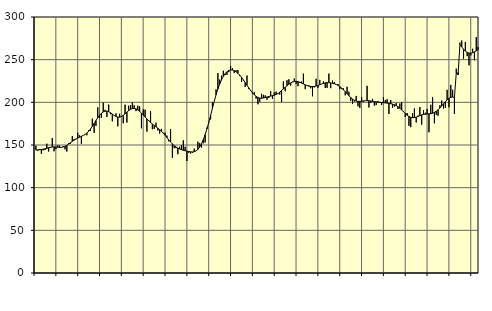
| Category | Piggar | Series 1 |
|---|---|---|
| nan | 149.1 | 144.2 |
| 1.0 | 143.1 | 144.2 |
| 1.0 | 145.3 | 144.4 |
| 1.0 | 139.7 | 144.72 |
| 1.0 | 143.7 | 145.1 |
| 1.0 | 144.1 | 145.56 |
| 1.0 | 151.5 | 146.1 |
| 1.0 | 142.4 | 146.74 |
| 1.0 | 147 | 147.3 |
| 1.0 | 158.2 | 147.66 |
| 1.0 | 142.6 | 147.77 |
| 1.0 | 145.2 | 147.68 |
| nan | 149.8 | 147.46 |
| 2.0 | 149.3 | 147.24 |
| 2.0 | 147 | 147.25 |
| 2.0 | 148.5 | 147.62 |
| 2.0 | 144.9 | 148.42 |
| 2.0 | 142.3 | 149.6 |
| 2.0 | 152.1 | 151.05 |
| 2.0 | 151.3 | 152.65 |
| 2.0 | 160.4 | 154.23 |
| 2.0 | 157.1 | 155.7 |
| 2.0 | 156.8 | 157.04 |
| 2.0 | 164.3 | 158.21 |
| nan | 161.3 | 159.2 |
| 3.0 | 151.4 | 160.14 |
| 3.0 | 161.2 | 161.12 |
| 3.0 | 162.5 | 162.33 |
| 3.0 | 161.4 | 163.97 |
| 3.0 | 167.3 | 166.14 |
| 3.0 | 166.6 | 168.78 |
| 3.0 | 180.9 | 171.86 |
| 3.0 | 164.3 | 175.22 |
| 3.0 | 172.4 | 178.63 |
| 3.0 | 194.1 | 181.92 |
| 3.0 | 181.7 | 184.84 |
| nan | 182 | 187.16 |
| 4.0 | 199.6 | 188.81 |
| 4.0 | 191.2 | 189.66 |
| 4.0 | 182.8 | 189.71 |
| 4.0 | 197.4 | 189.04 |
| 4.0 | 186 | 187.8 |
| 4.0 | 177.7 | 186.24 |
| 4.0 | 184.7 | 184.66 |
| 4.0 | 187.1 | 183.38 |
| 4.0 | 171.9 | 182.69 |
| 4.0 | 186.6 | 182.64 |
| 4.0 | 182.8 | 183.33 |
| nan | 175.4 | 184.71 |
| 5.0 | 197.3 | 186.5 |
| 5.0 | 176.3 | 188.46 |
| 5.0 | 196.1 | 190.36 |
| 5.0 | 196.6 | 191.83 |
| 5.0 | 199.8 | 192.67 |
| 5.0 | 196.7 | 192.83 |
| 5.0 | 189.7 | 192.31 |
| 5.0 | 196 | 191.13 |
| 5.0 | 195.3 | 189.45 |
| 5.0 | 169.6 | 187.43 |
| 5.0 | 191.7 | 185.19 |
| nan | 191.4 | 182.88 |
| 6.0 | 165.7 | 180.61 |
| 6.0 | 179.1 | 178.46 |
| 6.0 | 189.6 | 176.44 |
| 6.0 | 168.5 | 174.57 |
| 6.0 | 168.8 | 172.86 |
| 6.0 | 176.1 | 171.27 |
| 6.0 | 167 | 169.69 |
| 6.0 | 163.4 | 168.01 |
| 6.0 | 168.9 | 166.08 |
| 6.0 | 164.3 | 163.85 |
| 6.0 | 164.4 | 161.34 |
| nan | 161.1 | 158.66 |
| 7.0 | 154.4 | 156.01 |
| 7.0 | 168.7 | 153.55 |
| 7.0 | 135.1 | 151.31 |
| 7.0 | 146.2 | 149.32 |
| 7.0 | 146.3 | 147.69 |
| 7.0 | 139.2 | 146.37 |
| 7.0 | 148 | 145.29 |
| 7.0 | 149.6 | 144.45 |
| 7.0 | 155.5 | 143.79 |
| 7.0 | 147.9 | 143.27 |
| 7.0 | 131.3 | 142.8 |
| nan | 140.8 | 142.36 |
| 8.0 | 140 | 142.01 |
| 8.0 | 140.7 | 141.87 |
| 8.0 | 145.7 | 142.13 |
| 8.0 | 143.3 | 143.07 |
| 8.0 | 153.9 | 144.85 |
| 8.0 | 152.2 | 147.62 |
| 8.0 | 147.1 | 151.45 |
| 8.0 | 152 | 156.29 |
| 8.0 | 153 | 162.12 |
| 8.0 | 170.4 | 168.87 |
| 8.0 | 177.2 | 176.46 |
| nan | 180 | 184.62 |
| 9.0 | 200.1 | 192.95 |
| 9.0 | 201.1 | 201.11 |
| 9.0 | 215.2 | 208.76 |
| 9.0 | 234.3 | 215.61 |
| 9.0 | 226.7 | 221.53 |
| 9.0 | 231.3 | 226.45 |
| 9.0 | 237 | 230.43 |
| 9.0 | 232.1 | 233.56 |
| 9.0 | 232.2 | 235.83 |
| 9.0 | 235.4 | 237.27 |
| 9.0 | 242.5 | 237.91 |
| nan | 240.1 | 237.85 |
| 10.0 | 234.4 | 237.13 |
| 10.0 | 237.6 | 235.79 |
| 10.0 | 237.8 | 233.98 |
| 10.0 | 230.8 | 231.78 |
| 10.0 | 223.9 | 229.23 |
| 10.0 | 225.6 | 226.34 |
| 10.0 | 218.2 | 223.2 |
| 10.0 | 231.4 | 219.97 |
| 10.0 | 215.6 | 216.82 |
| 10.0 | 213.3 | 213.85 |
| 10.0 | 210.1 | 211.18 |
| nan | 212.2 | 208.89 |
| 11.0 | 204.3 | 207.07 |
| 11.0 | 197.7 | 205.77 |
| 11.0 | 200.7 | 205 |
| 11.0 | 210 | 204.81 |
| 11.0 | 208.8 | 205.05 |
| 11.0 | 208.2 | 205.61 |
| 11.0 | 203 | 206.25 |
| 11.0 | 205 | 206.84 |
| 11.0 | 213.2 | 207.33 |
| 11.0 | 204 | 207.82 |
| 11.0 | 211.6 | 208.41 |
| nan | 212.5 | 209.21 |
| 12.0 | 210.7 | 210.33 |
| 12.0 | 209 | 211.86 |
| 12.0 | 200.3 | 213.72 |
| 12.0 | 224.5 | 215.71 |
| 12.0 | 212.9 | 217.68 |
| 12.0 | 225.9 | 219.56 |
| 12.0 | 227 | 221.26 |
| 12.0 | 219.6 | 222.69 |
| 12.0 | 224.2 | 223.78 |
| 12.0 | 227.9 | 224.45 |
| 12.0 | 221.8 | 224.62 |
| nan | 218.9 | 224.3 |
| 13.0 | 222.8 | 223.58 |
| 13.0 | 224.3 | 222.6 |
| 13.0 | 233.6 | 221.53 |
| 13.0 | 215.4 | 220.52 |
| 13.0 | 219.5 | 219.66 |
| 13.0 | 219.9 | 219 |
| 13.0 | 216.5 | 218.58 |
| 13.0 | 207.1 | 218.45 |
| 13.0 | 217.5 | 218.63 |
| 13.0 | 227.6 | 219.09 |
| 13.0 | 217 | 219.76 |
| nan | 226.3 | 220.6 |
| 14.0 | 221.5 | 221.5 |
| 14.0 | 224.6 | 222.27 |
| 14.0 | 216.8 | 222.83 |
| 14.0 | 216.9 | 223.08 |
| 14.0 | 233.6 | 223.06 |
| 14.0 | 216.6 | 222.78 |
| 14.0 | 225.5 | 222.34 |
| 14.0 | 223.7 | 221.76 |
| 14.0 | 220.7 | 220.96 |
| 14.0 | 221.5 | 219.86 |
| 14.0 | 215.5 | 218.46 |
| nan | 215.5 | 216.74 |
| 15.0 | 216.4 | 214.73 |
| 15.0 | 208.2 | 212.52 |
| 15.0 | 218.2 | 210.14 |
| 15.0 | 212.5 | 207.8 |
| 15.0 | 201.7 | 205.65 |
| 15.0 | 198.2 | 203.79 |
| 15.0 | 201 | 202.4 |
| 15.0 | 207.5 | 201.51 |
| 15.0 | 195.3 | 201.09 |
| 15.0 | 193.4 | 201.05 |
| 15.0 | 206.2 | 201.3 |
| nan | 200.3 | 201.63 |
| 16.0 | 201.9 | 201.9 |
| 16.0 | 219.3 | 201.96 |
| 16.0 | 194 | 201.85 |
| 16.0 | 199.4 | 201.55 |
| 16.0 | 204 | 201.17 |
| 16.0 | 196.1 | 200.82 |
| 16.0 | 196.8 | 200.49 |
| 16.0 | 201.5 | 200.21 |
| 16.0 | 200 | 199.98 |
| 16.0 | 196.9 | 199.79 |
| 16.0 | 206.2 | 199.6 |
| nan | 202.7 | 199.37 |
| 17.0 | 203.7 | 199.09 |
| 17.0 | 186.4 | 198.75 |
| 17.0 | 202.7 | 198.36 |
| 17.0 | 193.7 | 197.91 |
| 17.0 | 195 | 197.18 |
| 17.0 | 199.2 | 196.13 |
| 17.0 | 192.2 | 194.77 |
| 17.0 | 198.6 | 193.04 |
| 17.0 | 200.3 | 191.07 |
| 17.0 | 189.6 | 188.96 |
| 17.0 | 182.9 | 186.87 |
| nan | 187.5 | 184.91 |
| 18.0 | 172.4 | 183.41 |
| 18.0 | 170.9 | 182.47 |
| 18.0 | 187.4 | 182.05 |
| 18.0 | 192.8 | 182.12 |
| 18.0 | 176.4 | 182.66 |
| 18.0 | 184.5 | 183.52 |
| 18.0 | 194.5 | 184.45 |
| 18.0 | 173.8 | 185.24 |
| 18.0 | 190.7 | 185.77 |
| 18.0 | 187.8 | 186.08 |
| 18.0 | 192.3 | 186.25 |
| nan | 164.9 | 186.44 |
| 19.0 | 197.2 | 186.74 |
| 19.0 | 205.8 | 187.27 |
| 19.0 | 175.4 | 188.2 |
| 19.0 | 185.4 | 189.53 |
| 19.0 | 184.3 | 191.28 |
| 19.0 | 196.6 | 193.42 |
| 19.0 | 202.1 | 195.78 |
| 19.0 | 192.8 | 198.27 |
| 19.0 | 193.7 | 200.73 |
| 19.0 | 214.6 | 202.88 |
| 19.0 | 194.2 | 204.64 |
| nan | 220.4 | 205.82 |
| 20.0 | 214.7 | 206.23 |
| 20.0 | 186.3 | 205.69 |
| 20.0 | 239.5 | 234.35 |
| 20.0 | 235.1 | 232.2 |
| 20.0 | 270 | 267.73 |
| 20.0 | 272.4 | 264.92 |
| 20.0 | 251.1 | 262.24 |
| 20.0 | 270.8 | 260.02 |
| 20.0 | 254.1 | 258.5 |
| 20.0 | 243.4 | 257.72 |
| 20.0 | 255 | 257.62 |
| nan | 262.8 | 258.15 |
| 21.0 | 249.3 | 259.09 |
| 21.0 | 276.4 | 260.36 |
| 21.0 | 264.7 | 261.78 |